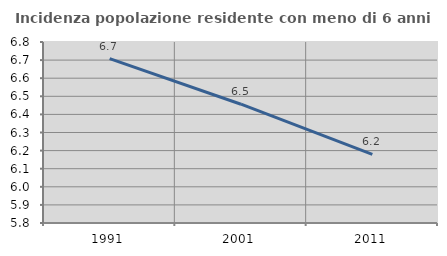
| Category | Incidenza popolazione residente con meno di 6 anni |
|---|---|
| 1991.0 | 6.708 |
| 2001.0 | 6.456 |
| 2011.0 | 6.18 |